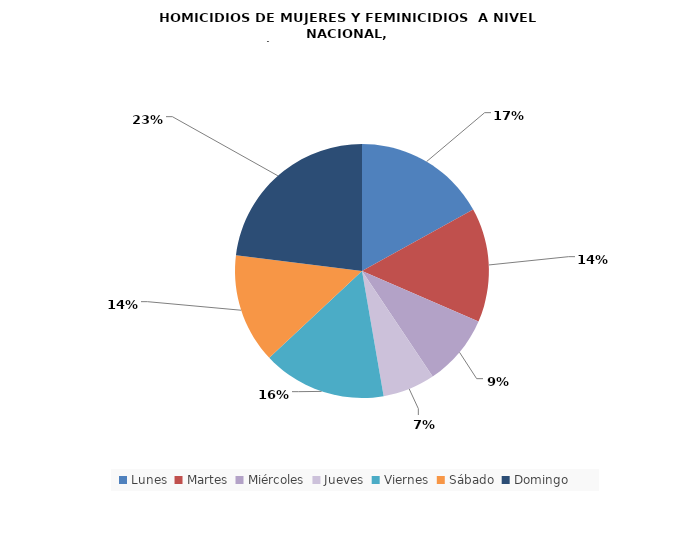
| Category | Lunes |
|---|---|
| Lunes | 28 |
| Martes | 24 |
| Miércoles | 15 |
| Jueves | 11 |
| Viernes | 26 |
| Sábado | 23 |
| Domingo | 38 |